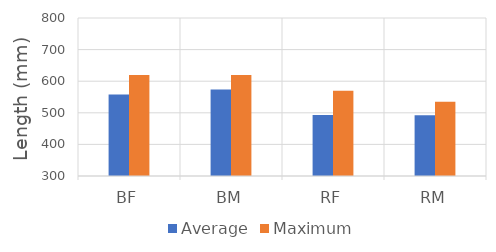
| Category | Average | Maximum |
|---|---|---|
| BF | 558 | 620 |
| BM | 574 | 620 |
| RF | 493 | 570 |
| RM | 492 | 535 |